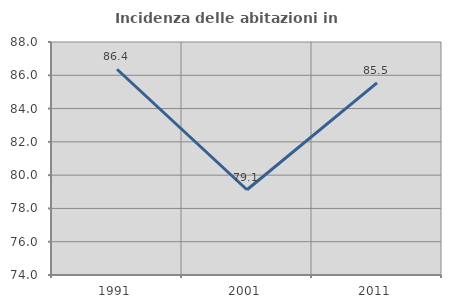
| Category | Incidenza delle abitazioni in proprietà  |
|---|---|
| 1991.0 | 86.364 |
| 2001.0 | 79.121 |
| 2011.0 | 85.542 |